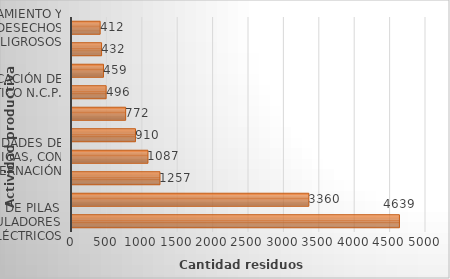
| Category | Series 0 |
|---|---|
| 2720 - Fabricación de pilas, baterías y acumuladores eléctricos | 4638.778 |
| 2410 - Industrias básicas de hierro y de acero | 3359.553 |
| 2599 - Fabricación de otros productos elaborados de metal n.c.p. | 1256.789 |
| 8610 - Actividades de hospitales y clínicas, con internación | 1086.839 |
| 8299 - Otras actividades de servicio de apoyo a las empresas n.c.p. | 910.458 |
| 4731 - Comercio al por menor de combustible para automotores | 772.041 |
| 2229 - Fabricación de artículos de plástico n.c.p. | 496.196 |
| 0124 - Cultivo de caña de azúcar | 458.759 |
| 2100 - Fabricación de productos farmacéuticos, sustancias químicas medicinales y productos botánicos de uso farmacéutico | 431.703 |
| 3822 - Tratamiento y disposición de desechos peligrosos | 412.015 |